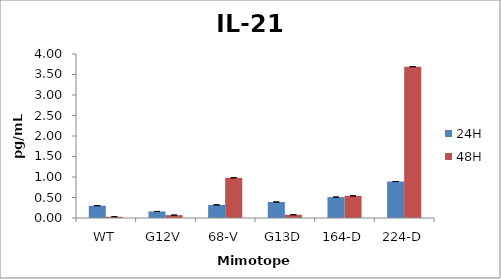
| Category | 24H | 48H |
|---|---|---|
| WT | 0.3 | 0.03 |
| G12V | 0.16 | 0.07 |
| 68-V | 0.32 | 0.98 |
| G13D | 0.39 | 0.08 |
| 164-D | 0.51 | 0.54 |
| 224-D | 0.89 | 3.69 |